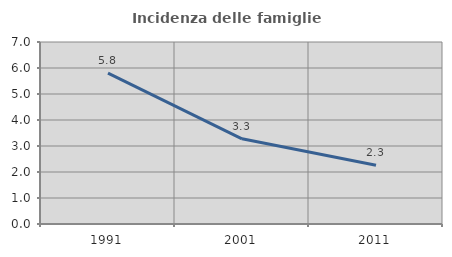
| Category | Incidenza delle famiglie numerose |
|---|---|
| 1991.0 | 5.806 |
| 2001.0 | 3.278 |
| 2011.0 | 2.257 |